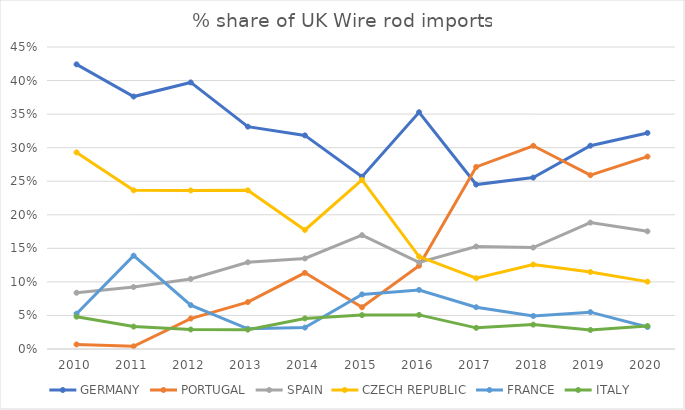
| Category | GERMANY | PORTUGAL | SPAIN | CZECH REPUBLIC | FRANCE | ITALY |
|---|---|---|---|---|---|---|
| 2010.0 | 0.424 | 0.007 | 0.084 | 0.293 | 0.053 | 0.048 |
| 2011.0 | 0.376 | 0.004 | 0.092 | 0.236 | 0.139 | 0.033 |
| 2012.0 | 0.397 | 0.045 | 0.104 | 0.236 | 0.065 | 0.029 |
| 2013.0 | 0.331 | 0.07 | 0.129 | 0.236 | 0.03 | 0.029 |
| 2014.0 | 0.318 | 0.113 | 0.135 | 0.177 | 0.032 | 0.046 |
| 2015.0 | 0.257 | 0.062 | 0.17 | 0.252 | 0.081 | 0.051 |
| 2016.0 | 0.353 | 0.124 | 0.129 | 0.138 | 0.088 | 0.051 |
| 2017.0 | 0.245 | 0.271 | 0.153 | 0.105 | 0.062 | 0.031 |
| 2018.0 | 0.255 | 0.303 | 0.151 | 0.126 | 0.049 | 0.036 |
| 2019.0 | 0.303 | 0.259 | 0.188 | 0.115 | 0.055 | 0.028 |
| 2020.0 | 0.322 | 0.287 | 0.175 | 0.1 | 0.033 | 0.034 |